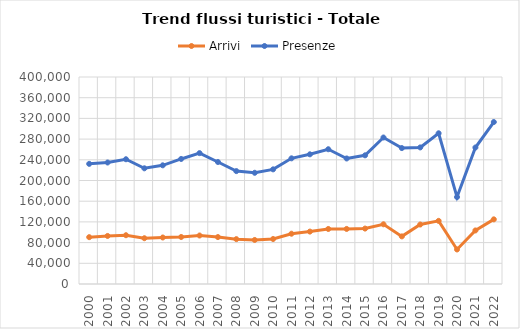
| Category | Arrivi | Presenze |
|---|---|---|
| 2000.0 | 90500 | 232168 |
| 2001.0 | 92829 | 234769 |
| 2002.0 | 94248 | 241059 |
| 2003.0 | 88450 | 223550 |
| 2004.0 | 89868 | 229336 |
| 2005.0 | 90847 | 241636 |
| 2006.0 | 93717 | 252895 |
| 2007.0 | 90691 | 235764 |
| 2008.0 | 86695 | 218157 |
| 2009.0 | 85101 | 214896 |
| 2010.0 | 86950 | 221542 |
| 2011.0 | 97187 | 242829 |
| 2012.0 | 101281 | 250594 |
| 2013.0 | 106344 | 260406 |
| 2014.0 | 106406 | 242543 |
| 2015.0 | 107122 | 248656 |
| 2016.0 | 115391 | 283076 |
| 2017.0 | 92021 | 262656 |
| 2018.0 | 114921 | 263902 |
| 2019.0 | 122002 | 291244 |
| 2020.0 | 66738 | 168013 |
| 2021.0 | 103485 | 263734 |
| 2022.0 | 124938 | 312972 |